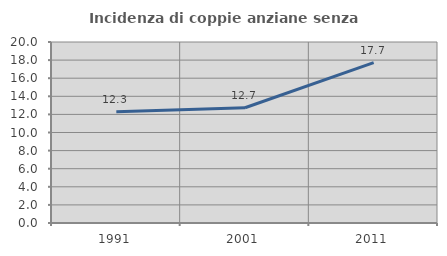
| Category | Incidenza di coppie anziane senza figli  |
|---|---|
| 1991.0 | 12.286 |
| 2001.0 | 12.737 |
| 2011.0 | 17.718 |